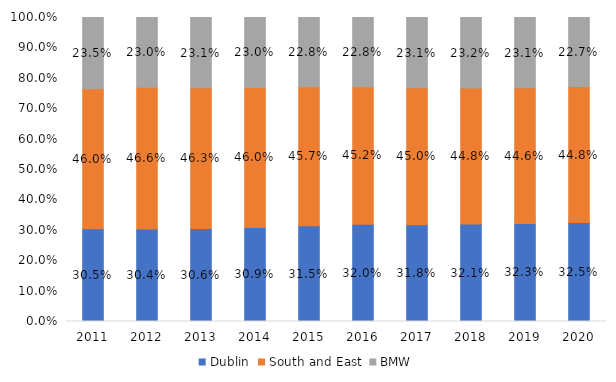
| Category | Dublin | South and East | BMW |
|---|---|---|---|
| 2011.0 | 0.305 | 0.46 | 0.235 |
| 2012.0 | 0.304 | 0.466 | 0.23 |
| 2013.0 | 0.306 | 0.463 | 0.231 |
| 2014.0 | 0.309 | 0.46 | 0.23 |
| 2015.0 | 0.315 | 0.457 | 0.228 |
| 2016.0 | 0.32 | 0.452 | 0.228 |
| 2017.0 | 0.318 | 0.45 | 0.231 |
| 2018.0 | 0.321 | 0.448 | 0.232 |
| 2019.0 | 0.323 | 0.446 | 0.231 |
| 2020.0 | 0.325 | 0.448 | 0.227 |